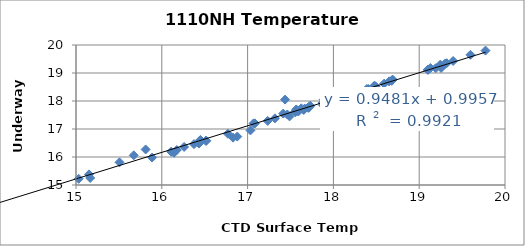
| Category | Series 0 |
|---|---|
| 17.4367 | 18.05 |
| 17.4151 | 17.55 |
| 17.666 | 17.73 |
| 17.9922 | 18.09 |
| 18.0043 | 18.07 |
| 18.2117 | 18.28 |
| 18.221 | 18.28 |
| 18.4915 | 18.52 |
| 18.3898 | 18.43 |
| 17.9757 | 18.1 |
| 18.1576 | 18.23 |
| 18.5913 | 18.62 |
| 18.6796 | 18.72 |
| 19.1017 | 19.11 |
| 19.1004 | 19.12 |
| 18.6917 | 18.76 |
| 18.6874 | 18.76 |
| 19.3034 | 19.34 |
| 19.3956 | 19.43 |
| 19.7729 | 19.8 |
| 19.5975 | 19.65 |
| 19.2462 | 19.3 |
| 19.3203 | 19.35 |
| 19.1307 | 19.18 |
| 18.4793 | 18.55 |
| 18.6487 | 18.7 |
| 17.7299 | 17.83 |
| 17.8837 | 17.96 |
| 17.0857 | 17.2 |
| 18.0009 | 17.98 |
| 17.8735 | 17.93 |
| 17.0694 | 17.2 |
| 16.8304 | 16.69 |
| 16.7697 | 16.83 |
| 17.033 | 16.95 |
| 15.6728 | 16.06 |
| 17.4893 | 17.45 |
| 16.2601 | 16.36 |
| 16.109 | 16.19 |
| 15.812 | 16.27 |
| 17.7218 | 17.8 |
| 19.1922 | 19.17 |
| 19.2557 | 19.18 |
| 17.8874 | 18.05 |
| 18.408 | 18.43 |
| 17.8962 | 18 |
| 17.5943 | 17.63 |
| 18.4673 | 18.5 |
| 17.6251 | 17.74 |
| 17.3185 | 17.38 |
| 17.2339 | 17.29 |
| 17.5671 | 17.7 |
| 16.3753 | 16.46 |
| 16.1744 | 16.25 |
| 15.1512 | 15.38 |
| 16.45 | 16.61 |
| 16.1418 | 16.15 |
| 15.5068 | 15.81 |
| 16.4456 | 16.58 |
| 15.0316 | 15.22 |
| 15.166 | 15.25 |
| 16.8797 | 16.73 |
| 17.7142 | 17.76 |
| 17.5755 | 17.64 |
| 17.5531 | 17.62 |
| 17.6539 | 17.68 |
| 17.7037 | 17.76 |
| 17.8793 | 17.85 |
| 17.5583 | 17.6 |
| 17.463 | 17.52 |
| 16.4337 | 16.48 |
| 15.8864 | 15.98 |
| 16.5121 | 16.58 |
| 16.5192 | 16.58 |
| 14.1776 | 14.41 |
| 13.3585 | 14.01 |